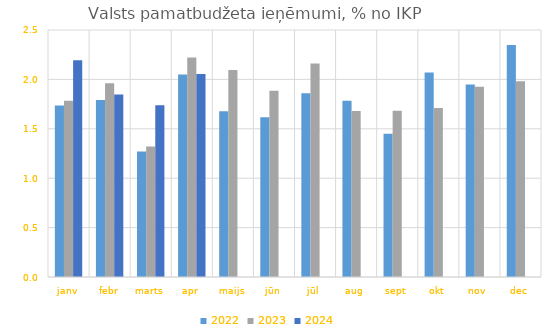
| Category | 2022 | 2023 | 2024 |
|---|---|---|---|
| janv | 1.737 | 1.784 | 2.195 |
| febr | 1.792 | 1.962 | 1.848 |
| marts | 1.27 | 1.322 | 1.74 |
| apr | 2.05 | 2.221 | 2.054 |
| maijs | 1.678 | 2.095 | 0 |
| jūn | 1.616 | 1.885 | 0 |
| jūl | 1.86 | 2.16 | 0 |
| aug | 1.785 | 1.68 | 0 |
| sept | 1.449 | 1.682 | 0 |
| okt | 2.069 | 1.71 | 0 |
| nov | 1.949 | 1.926 | 0 |
| dec | 2.347 | 1.98 | 0 |